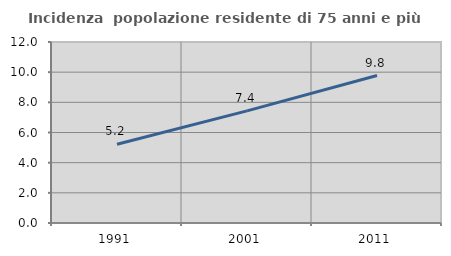
| Category | Incidenza  popolazione residente di 75 anni e più |
|---|---|
| 1991.0 | 5.226 |
| 2001.0 | 7.435 |
| 2011.0 | 9.778 |